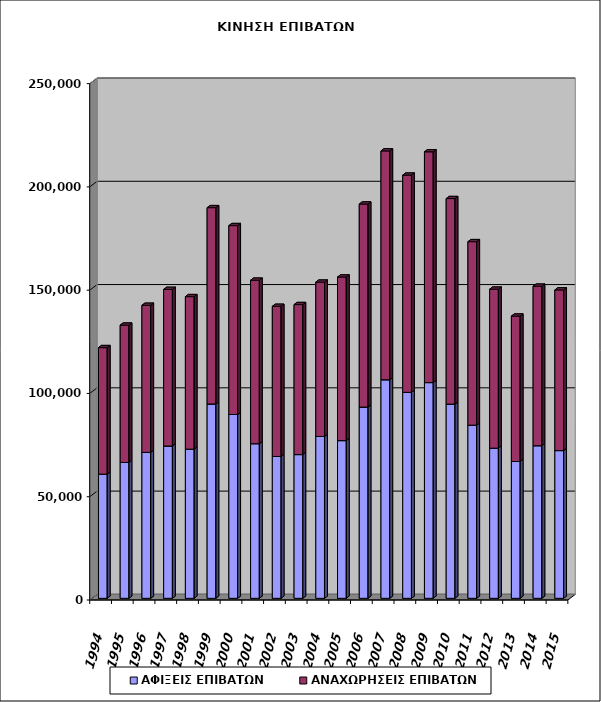
| Category | ΑΦΙΞΕΙΣ ΕΠΙΒΑΤΩΝ | ΑΝΑΧΩΡΗΣΕΙΣ ΕΠΙΒΑΤΩΝ |
|---|---|---|
| 1994.0 | 60122 | 61248 |
| 1995.0 | 65769 | 66500 |
| 1996.0 | 70656 | 71208 |
| 1997.0 | 73734 | 75830 |
| 1998.0 | 72216 | 73840 |
| 1999.0 | 94085 | 95047 |
| 2000.0 | 88999 | 91447 |
| 2001.0 | 74864 | 79140 |
| 2002.0 | 68674 | 72688 |
| 2003.0 | 69584 | 72628 |
| 2004.0 | 78360 | 74707 |
| 2005.0 | 76355 | 79179 |
| 2006.0 | 92586 | 98293 |
| 2007.0 | 105823 | 110782 |
| 2008.0 | 99732 | 105141 |
| 2009.0 | 104440 | 111734 |
| 2010.0 | 94025 | 99505 |
| 2011.0 | 83834 | 88838 |
| 2012.0 | 72686 | 76978 |
| 2013.0 | 66230 | 70411 |
| 2014.0 | 73886 | 77221 |
| 2015.0 | 71520 | 77782 |